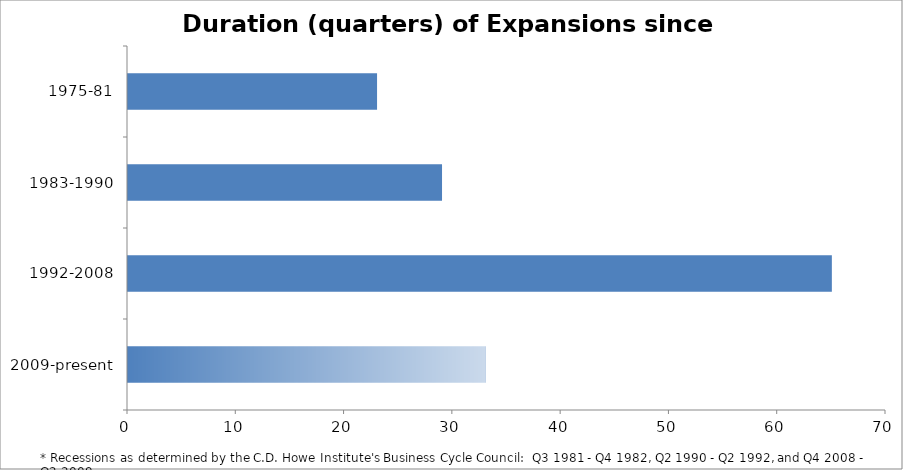
| Category | Length of Expansion |
|---|---|
| 2009-present | 33 |
| 1992-2008 | 65 |
| 1983-1990 | 29 |
| 1975-81 | 23 |